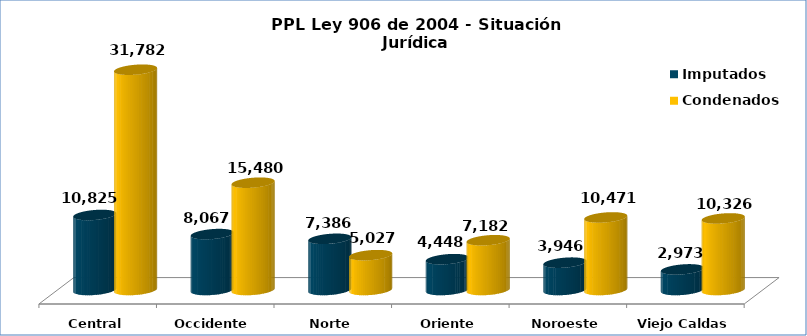
| Category | Imputados | Condenados |
|---|---|---|
| Central | 10825 | 31782 |
| Occidente | 8067 | 15480 |
| Norte | 7386 | 5027 |
| Oriente | 4448 | 7182 |
| Noroeste | 3946 | 10471 |
| Viejo Caldas | 2973 | 10326 |